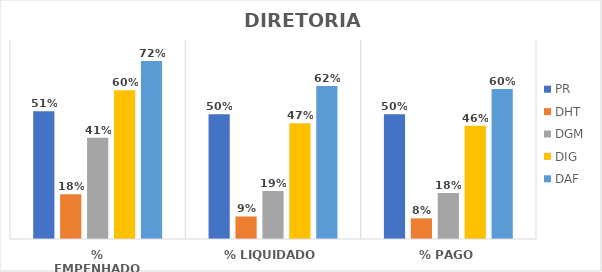
| Category | PR | DHT | DGM | DIG | DAF |
|---|---|---|---|---|---|
| % EMPENHADO | 0.514 | 0.18 | 0.407 | 0.598 | 0.716 |
| % LIQUIDADO | 0.502 | 0.091 | 0.192 | 0.465 | 0.615 |
| % PAGO | 0.502 | 0.083 | 0.185 | 0.456 | 0.603 |